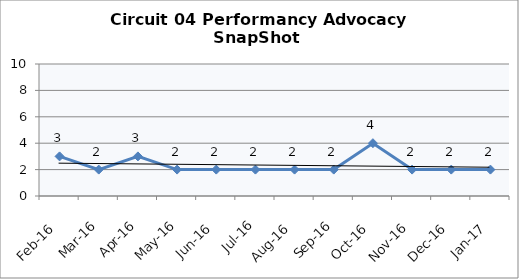
| Category | Circuit 04 |
|---|---|
| Feb-16 | 3 |
| Mar-16 | 2 |
| Apr-16 | 3 |
| May-16 | 2 |
| Jun-16 | 2 |
| Jul-16 | 2 |
| Aug-16 | 2 |
| Sep-16 | 2 |
| Oct-16 | 4 |
| Nov-16 | 2 |
| Dec-16 | 2 |
| Jan-17 | 2 |